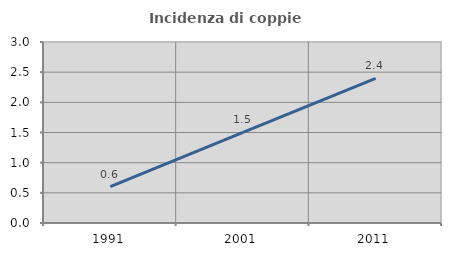
| Category | Incidenza di coppie miste |
|---|---|
| 1991.0 | 0.603 |
| 2001.0 | 1.501 |
| 2011.0 | 2.398 |